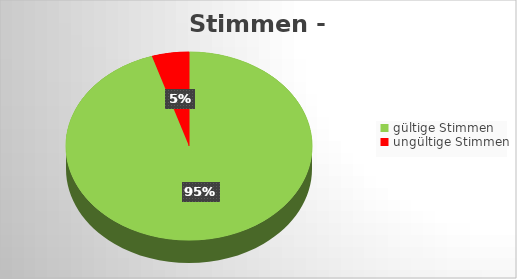
| Category | Series 0 |
|---|---|
| gültige Stimmen | 293 |
| ungültige Stimmen | 15 |